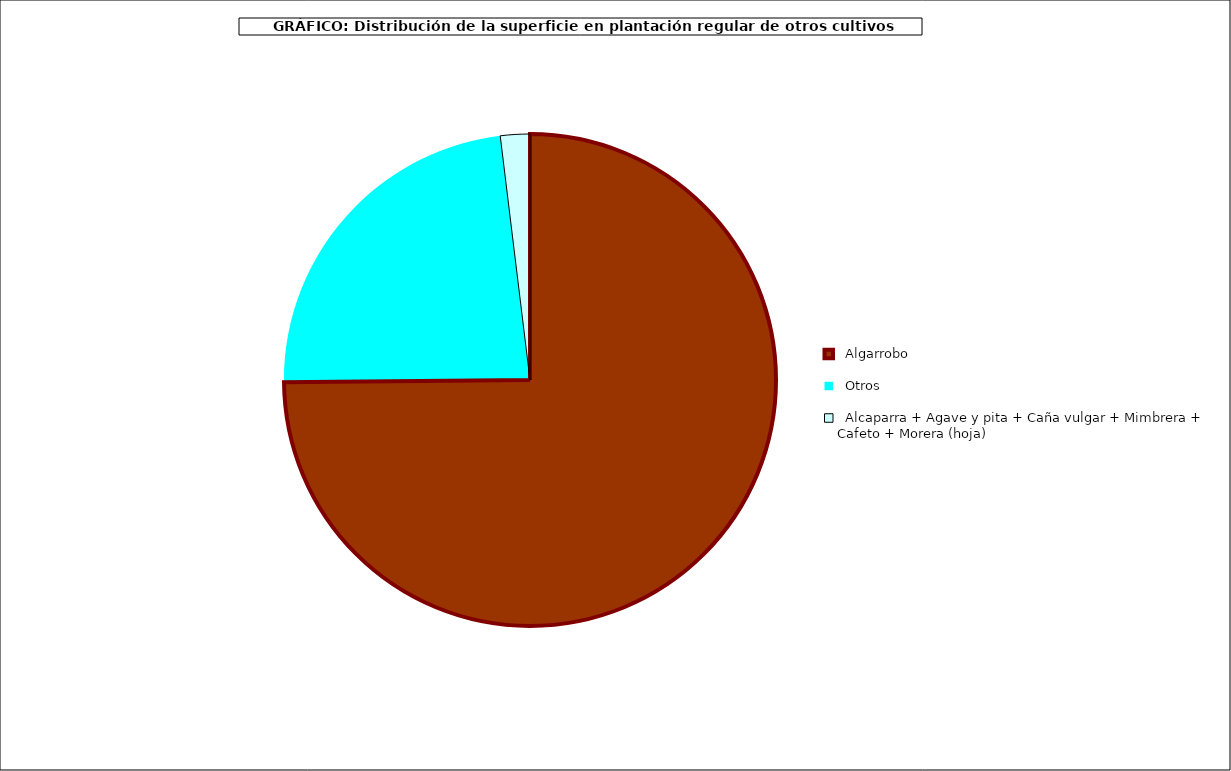
| Category | Series 0 |
|---|---|
|    Algarrobo  | 39835 |
|    Otros  | 12352 |
|    Alcaparra + Agave y pita + Caña vulgar + Mimbrera + Cafeto + Morera (hoja)  | 1028 |